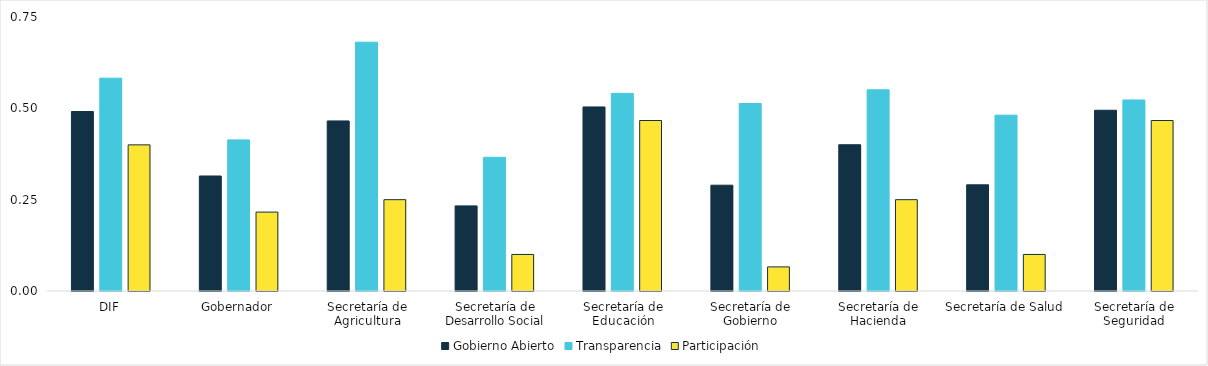
| Category | Gobierno Abierto | Transparencia | Participación |
|---|---|---|---|
| DIF | 0.491 | 0.583 | 0.4 |
| Gobernador | 0.315 | 0.414 | 0.216 |
| Secretaría de Agricultura | 0.466 | 0.681 | 0.25 |
| Secretaría de Desarrollo Social | 0.233 | 0.366 | 0.1 |
| Secretaría de Educación | 0.504 | 0.541 | 0.467 |
| Secretaría de Gobierno | 0.29 | 0.513 | 0.066 |
| Secretaría de Hacienda | 0.4 | 0.551 | 0.25 |
| Secretaría de Salud | 0.291 | 0.481 | 0.1 |
| Secretaría de Seguridad | 0.495 | 0.523 | 0.467 |